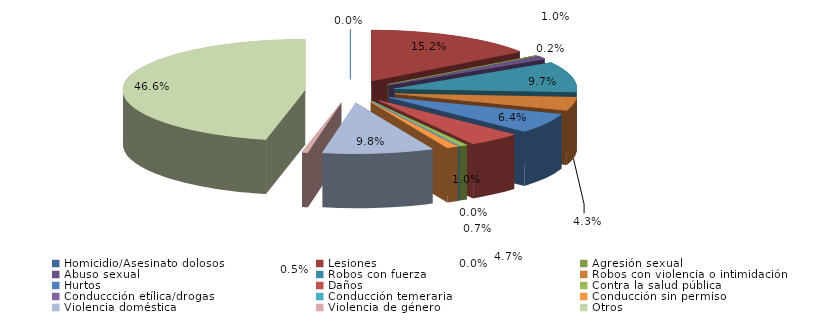
| Category | Series 0 |
|---|---|
| Homicidio/Asesinato dolosos | 0 |
| Lesiones | 88 |
| Agresión sexual | 1 |
| Abuso sexual | 6 |
| Robos con fuerza | 56 |
| Robos con violencia o intimidación | 25 |
| Hurtos | 37 |
| Daños | 27 |
| Contra la salud pública | 4 |
| Conduccción etílica/drogas | 0 |
| Conducción temeraria | 0 |
| Conducción sin permiso | 6 |
| Violencia doméstica | 57 |
| Violencia de género | 3 |
| Otros | 270 |